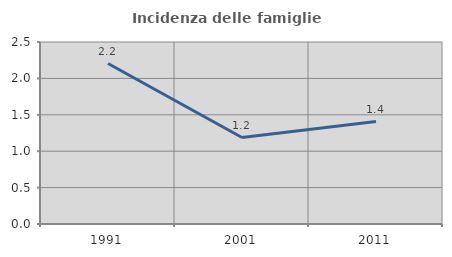
| Category | Incidenza delle famiglie numerose |
|---|---|
| 1991.0 | 2.204 |
| 2001.0 | 1.187 |
| 2011.0 | 1.407 |